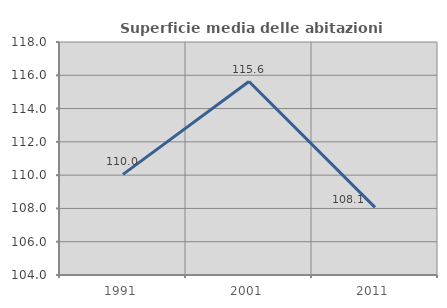
| Category | Superficie media delle abitazioni occupate |
|---|---|
| 1991.0 | 110.046 |
| 2001.0 | 115.624 |
| 2011.0 | 108.066 |